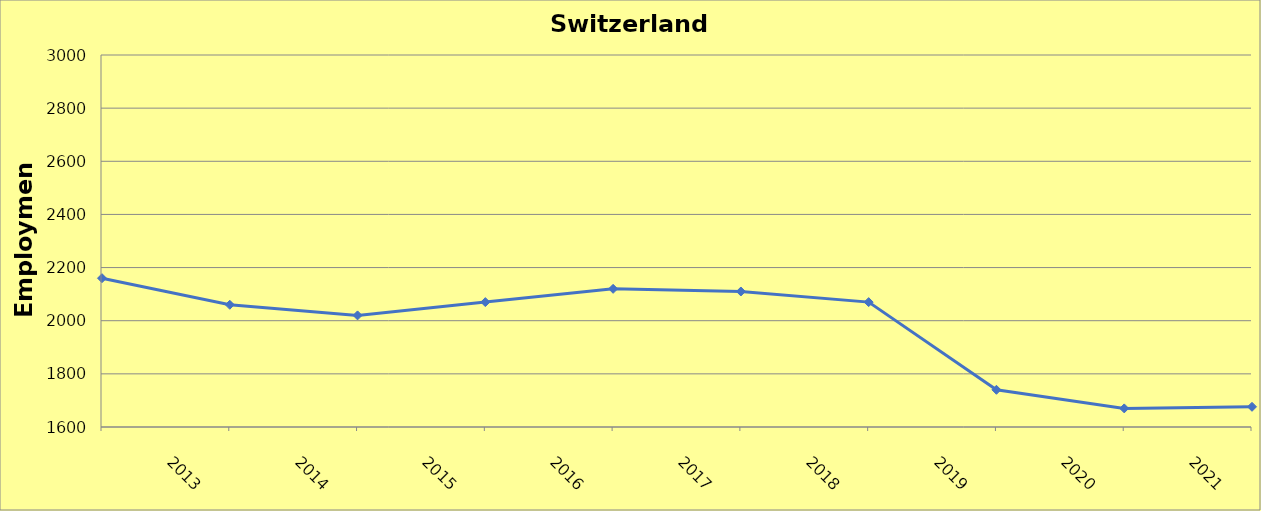
| Category | Switzerland County |
|---|---|
| 2013.0 | 2160 |
| 2014.0 | 2060 |
| 2015.0 | 2020 |
| 2016.0 | 2070 |
| 2017.0 | 2120 |
| 2018.0 | 2110 |
| 2019.0 | 2070 |
| 2020.0 | 1740 |
| 2021.0 | 1670 |
| 2022.0 | 1676 |